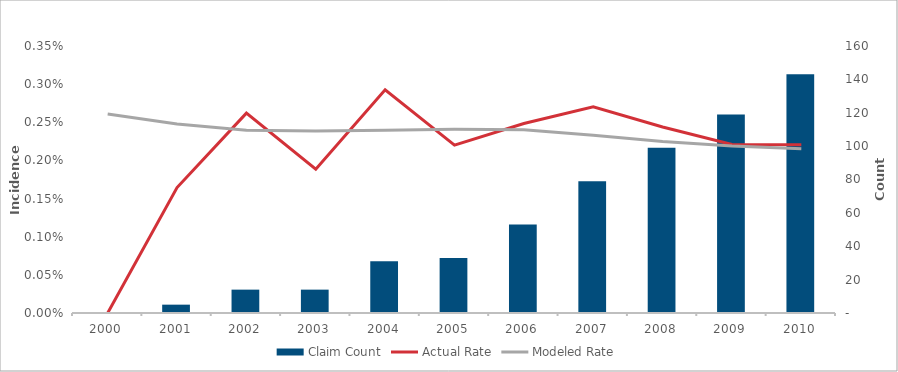
| Category | Claim Count |
|---|---|
| 2000.0 | 0 |
| 2001.0 | 5 |
| 2002.0 | 14 |
| 2003.0 | 14 |
| 2004.0 | 31 |
| 2005.0 | 33 |
| 2006.0 | 53 |
| 2007.0 | 79 |
| 2008.0 | 99 |
| 2009.0 | 119 |
| 2010.0 | 143 |